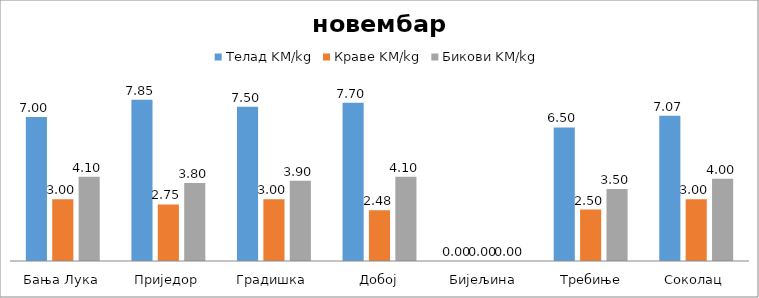
| Category | Телад KM/kg | Краве KM/kg | Бикови KM/kg |
|---|---|---|---|
| Бања Лука | 7 | 3 | 4.1 |
| Приједор | 7.85 | 2.75 | 3.8 |
| Градишка | 7.5 | 3 | 3.9 |
| Добој | 7.7 | 2.475 | 4.1 |
| Бијељина | 0 | 0 | 0 |
|  Требиње | 6.5 | 2.5 | 3.5 |
| Соколац | 7.067 | 3 | 4 |